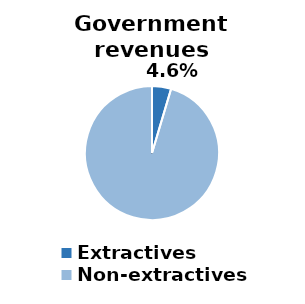
| Category | Government revenues (%) |
|---|---|
| Extractives | 0.046 |
| Non-extractives | 0.954 |